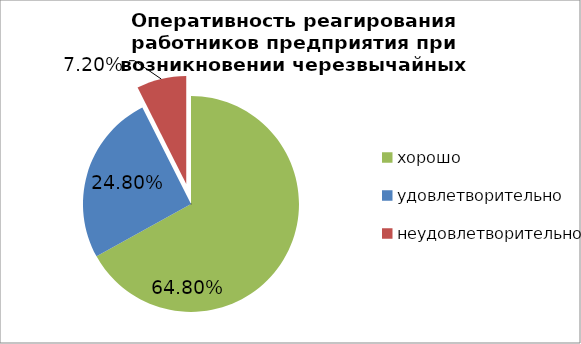
| Category | Series 1 |
|---|---|
| хорошо | 0.648 |
| удовлетворительно | 0.248 |
| неудовлетворительно | 0.072 |